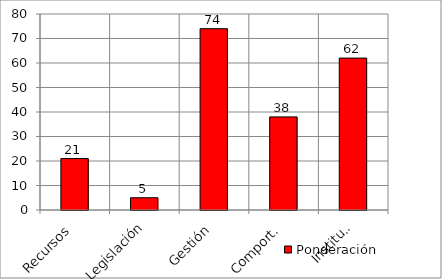
| Category | Ponderación |
|---|---|
| Recursos | 21 |
| Legislación | 5 |
| Gestión | 74 |
| Comport. | 38 |
| Instituc. | 62 |